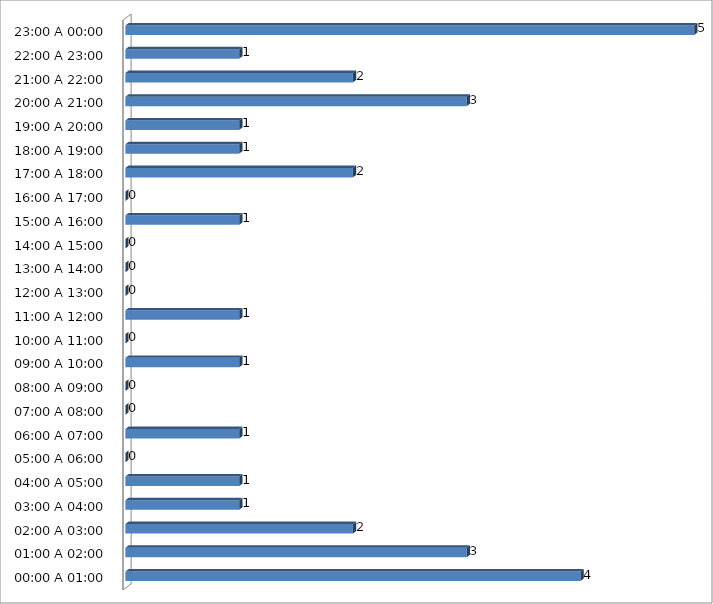
| Category | Series 0 |
|---|---|
| 00:00 A 01:00 | 4 |
| 01:00 A 02:00 | 3 |
| 02:00 A 03:00 | 2 |
| 03:00 A 04:00 | 1 |
| 04:00 A 05:00 | 1 |
| 05:00 A 06:00 | 0 |
| 06:00 A 07:00 | 1 |
| 07:00 A 08:00 | 0 |
| 08:00 A 09:00 | 0 |
| 09:00 A 10:00 | 1 |
| 10:00 A 11:00 | 0 |
| 11:00 A 12:00 | 1 |
| 12:00 A 13:00 | 0 |
| 13:00 A 14:00 | 0 |
| 14:00 A 15:00 | 0 |
| 15:00 A 16:00 | 1 |
| 16:00 A 17:00 | 0 |
| 17:00 A 18:00 | 2 |
| 18:00 A 19:00 | 1 |
| 19:00 A 20:00 | 1 |
| 20:00 A 21:00 | 3 |
| 21:00 A 22:00 | 2 |
| 22:00 A 23:00 | 1 |
| 23:00 A 00:00 | 5 |